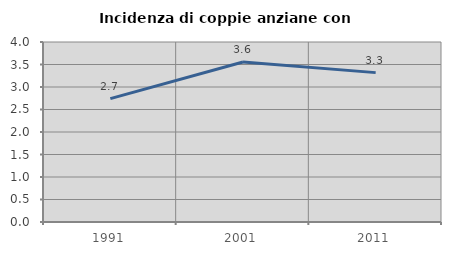
| Category | Incidenza di coppie anziane con figli |
|---|---|
| 1991.0 | 2.742 |
| 2001.0 | 3.556 |
| 2011.0 | 3.32 |